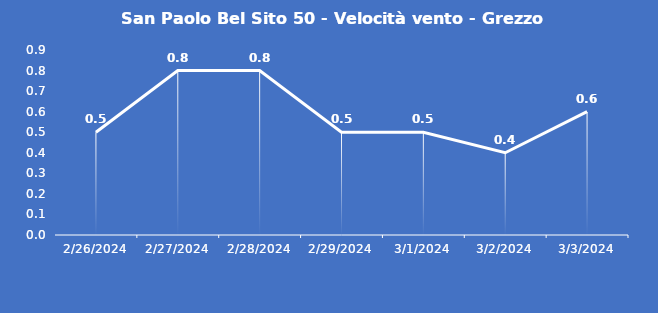
| Category | San Paolo Bel Sito 50 - Velocità vento - Grezzo (m/s) |
|---|---|
| 2/26/24 | 0.5 |
| 2/27/24 | 0.8 |
| 2/28/24 | 0.8 |
| 2/29/24 | 0.5 |
| 3/1/24 | 0.5 |
| 3/2/24 | 0.4 |
| 3/3/24 | 0.6 |